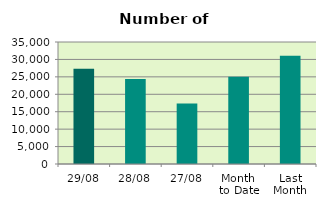
| Category | Series 0 |
|---|---|
| 29/08 | 27332 |
| 28/08 | 24364 |
| 27/08 | 17382 |
| Month 
to Date | 25040.857 |
| Last
Month | 31061.545 |